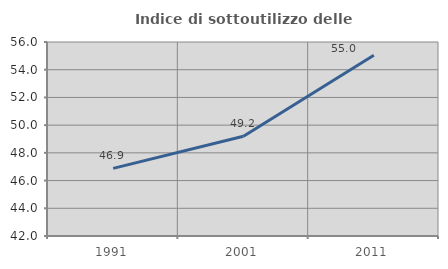
| Category | Indice di sottoutilizzo delle abitazioni  |
|---|---|
| 1991.0 | 46.88 |
| 2001.0 | 49.199 |
| 2011.0 | 55.041 |